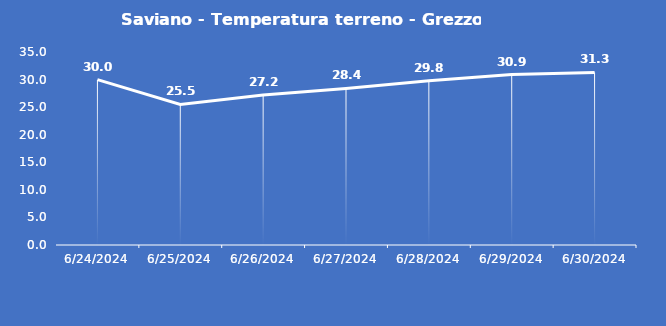
| Category | Saviano - Temperatura terreno - Grezzo (°C) |
|---|---|
| 6/24/24 | 30 |
| 6/25/24 | 25.5 |
| 6/26/24 | 27.2 |
| 6/27/24 | 28.4 |
| 6/28/24 | 29.8 |
| 6/29/24 | 30.9 |
| 6/30/24 | 31.3 |